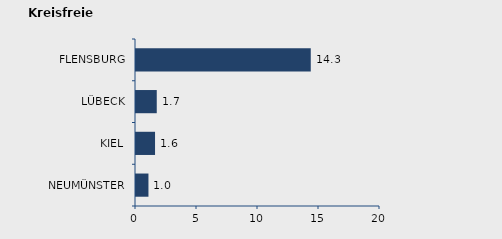
| Category | Wanderungssaldo |
|---|---|
| NEUMÜNSTER | 1.021 |
| KIEL | 1.561 |
| LÜBECK | 1.701 |
| FLENSBURG | 14.325 |